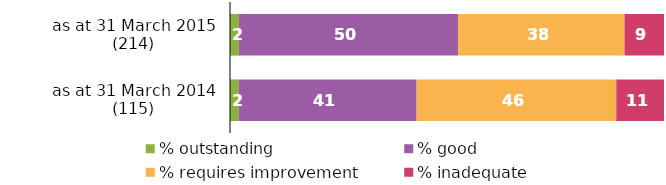
| Category | % outstanding | % good | % requires improvement | % inadequate |
|---|---|---|---|---|
| as at 31 March 2015 (214) | 2 | 50 | 38 | 9 |
| as at 31 March 2014 (115) | 2 | 41 | 46 | 11 |